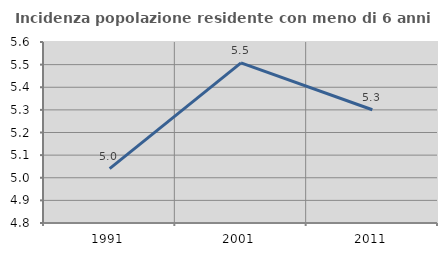
| Category | Incidenza popolazione residente con meno di 6 anni |
|---|---|
| 1991.0 | 5.04 |
| 2001.0 | 5.508 |
| 2011.0 | 5.301 |